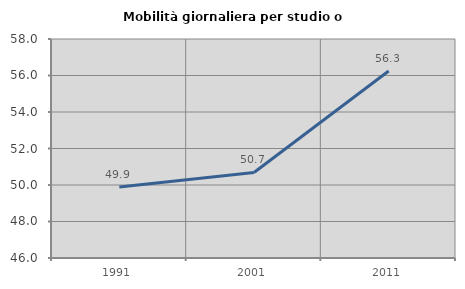
| Category | Mobilità giornaliera per studio o lavoro |
|---|---|
| 1991.0 | 49.896 |
| 2001.0 | 50.688 |
| 2011.0 | 56.25 |